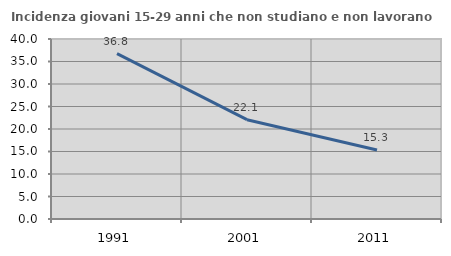
| Category | Incidenza giovani 15-29 anni che non studiano e non lavorano  |
|---|---|
| 1991.0 | 36.759 |
| 2001.0 | 22.068 |
| 2011.0 | 15.332 |